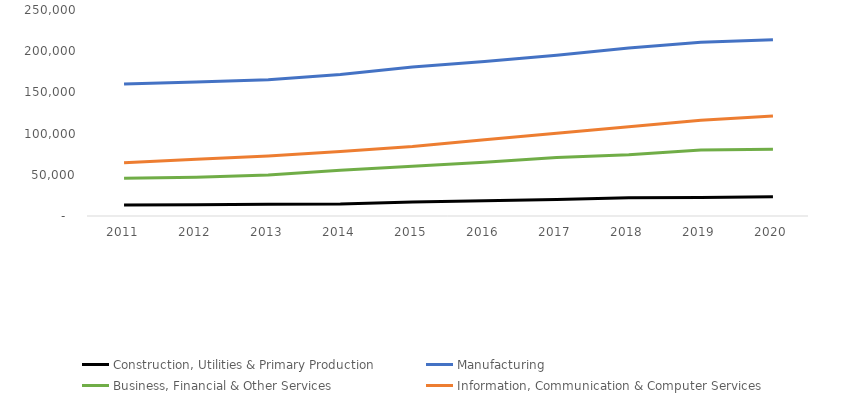
| Category | Construction, Utilities & Primary Production  | Manufacturing  | Business, Financial & Other Services | Information, Communication & Computer Services |
|---|---|---|---|---|
| 2011.0 | 13317 | 160247 | 45768 | 64512 |
| 2012.0 | 13693 | 162740 | 47079 | 68795 |
| 2013.0 | 14296 | 165288 | 49907 | 72848 |
| 2014.0 | 14573 | 171762 | 55653 | 78165 |
| 2015.0 | 17037 | 180877 | 60321 | 84260 |
| 2016.0 | 18423 | 187637 | 65091 | 92581 |
| 2017.0 | 19970 | 195152 | 71056 | 100523 |
| 2018.0 | 22283 | 204011 | 74474 | 108220 |
| 2019.0 | 22309 | 210767 | 79999 | 116224 |
| 2020.0 | 23367 | 213755 | 80921 | 121339 |